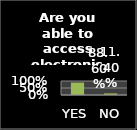
| Category | Series 0 |
|---|---|
| YES | 0.886 |
| NO | 0.114 |